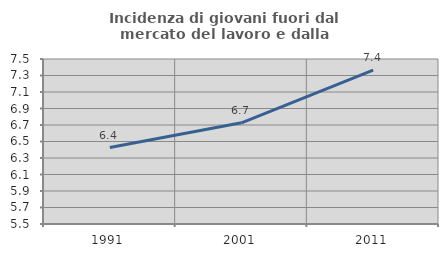
| Category | Incidenza di giovani fuori dal mercato del lavoro e dalla formazione  |
|---|---|
| 1991.0 | 6.427 |
| 2001.0 | 6.727 |
| 2011.0 | 7.364 |